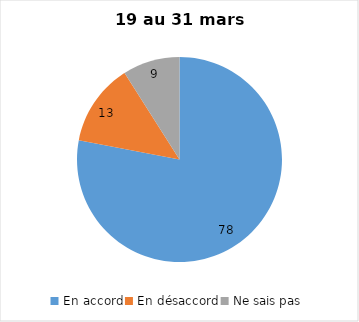
| Category | Series 0 |
|---|---|
| En accord | 78 |
| En désaccord | 13 |
| Ne sais pas | 9 |